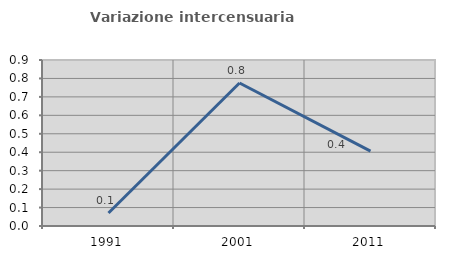
| Category | Variazione intercensuaria annua |
|---|---|
| 1991.0 | 0.071 |
| 2001.0 | 0.775 |
| 2011.0 | 0.406 |